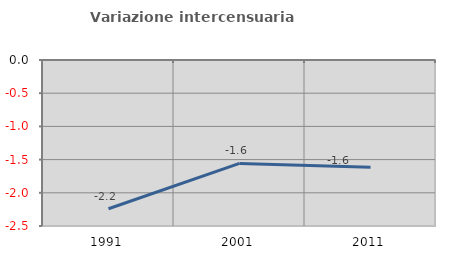
| Category | Variazione intercensuaria annua |
|---|---|
| 1991.0 | -2.24 |
| 2001.0 | -1.558 |
| 2011.0 | -1.614 |